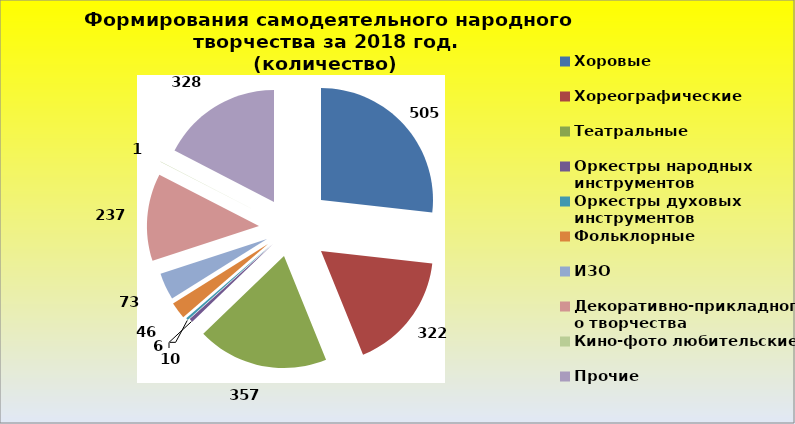
| Category | Series 0 |
|---|---|
| Хоровые | 505 |
| Хореографические | 322 |
| Театральные | 357 |
| Оркестры народных инструментов | 10 |
| Оркестры духовых инструментов | 6 |
| Фольклорные | 46 |
| ИЗО | 73 |
| Декоративно-прикладного творчества | 237 |
| Кино-фото любительские | 1 |
| Прочие | 328 |